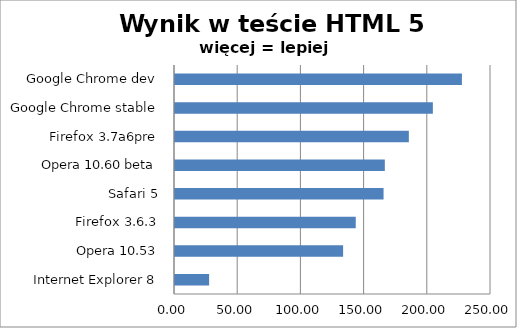
| Category | Series 0 |
|---|---|
| Internet Explorer 8 | 27 |
| Opera 10.53 | 133 |
| Firefox 3.6.3 | 143 |
| Safari 5 | 165 |
| Opera 10.60 beta | 166 |
| Firefox 3.7a6pre | 185 |
| Google Chrome stable | 204 |
| Google Chrome dev | 227 |